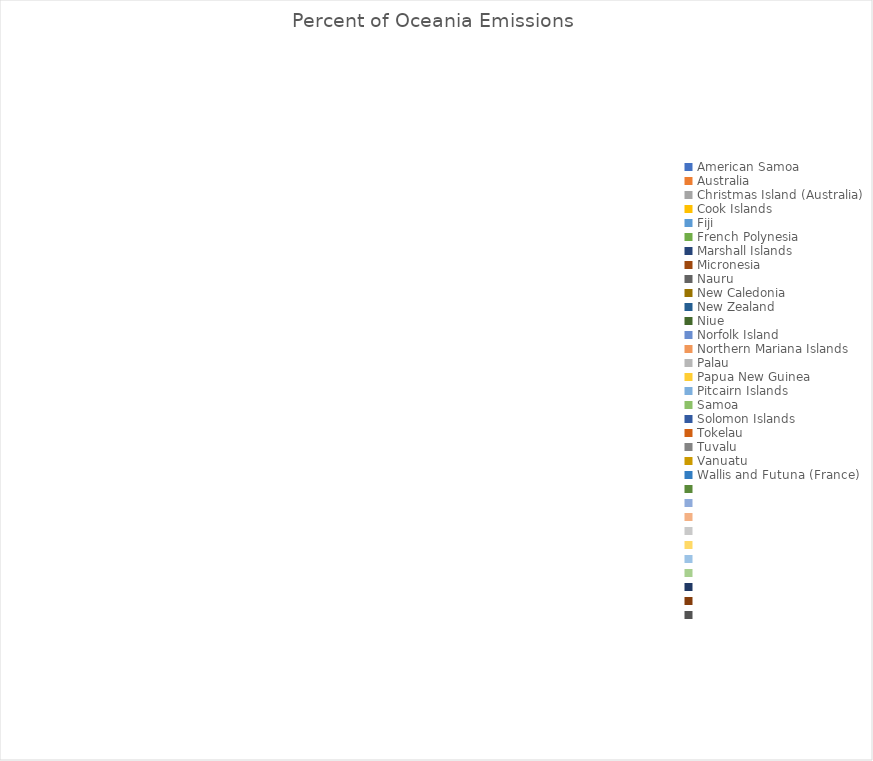
| Category | Percent of Oceania Emissions  |
|---|---|
| American Samoa | 0 |
| Australia | 0 |
| Christmas Island (Australia) | 0 |
| Cook Islands | 0 |
| Fiji | 0 |
| French Polynesia | 0 |
| Marshall Islands | 0 |
| Micronesia | 0 |
| Nauru | 0 |
| New Caledonia | 0 |
| New Zealand | 0 |
| Niue | 0 |
| Norfolk Island | 0 |
| Northern Mariana Islands | 0 |
| Palau | 0 |
| Papua New Guinea | 0 |
| Pitcairn Islands | 0 |
| Samoa | 0 |
| Solomon Islands | 0 |
| Tokelau | 0 |
| Tuvalu | 0 |
| Vanuatu | 0 |
| Wallis and Futuna (France) | 0 |